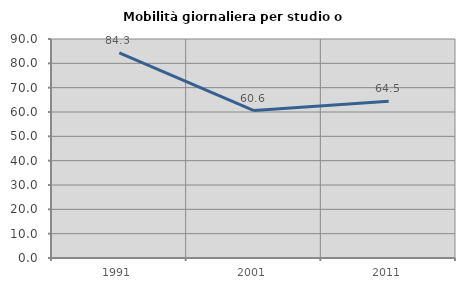
| Category | Mobilità giornaliera per studio o lavoro |
|---|---|
| 1991.0 | 84.295 |
| 2001.0 | 60.57 |
| 2011.0 | 64.456 |